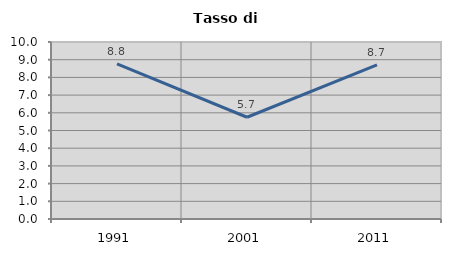
| Category | Tasso di disoccupazione   |
|---|---|
| 1991.0 | 8.763 |
| 2001.0 | 5.749 |
| 2011.0 | 8.708 |